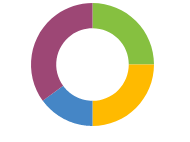
| Category | ACTIVE |
|---|---|
| Numerar | 5 |
| Investiții | 5 |
| Pensie | 3 |
| Obiecte | 7 |